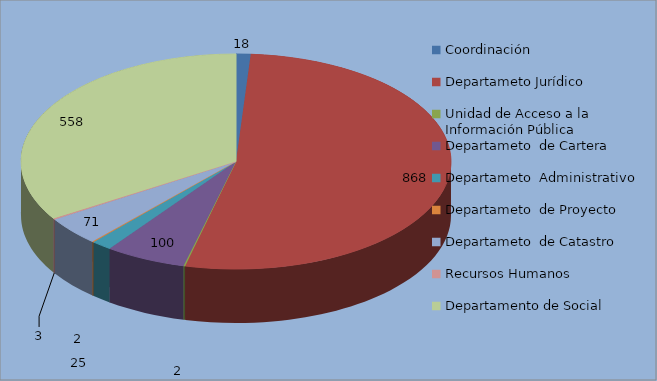
| Category | Series 0 |
|---|---|
| Coordinación | 18 |
| Departameto Jurídico  | 868 |
| Unidad de Acceso a la Información Pública | 2 |
| Departameto  de Cartera | 100 |
| Departameto  Administrativo | 25 |
| Departameto  de Proyecto | 2 |
| Departameto  de Catastro | 71 |
| Recursos Humanos  | 3 |
| Departamento de Social | 558 |